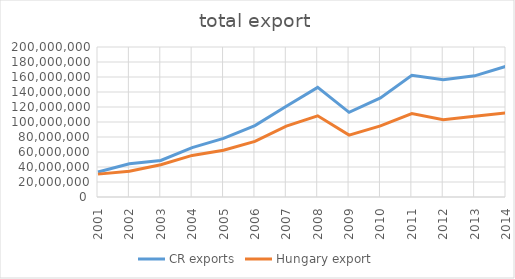
| Category | CR exports | Hungary export |
|---|---|---|
| 2001.0 | 33384210 | 30497719 |
| 2002.0 | 44263576 | 34336583 |
| 2003.0 | 48720350 | 43003656 |
| 2004.0 | 65771587 | 55468212 |
| 2005.0 | 78208548 | 62271839 |
| 2006.0 | 95140986 | 74055406 |
| 2007.0 | 120900492 | 94590870 |
| 2008.0 | 146087029 | 108211166 |
| 2009.0 | 112884321 | 82571847 |
| 2010.0 | 132140914 | 94748737 |
| 2011.0 | 162391721 | 111216834 |
| 2012.0 | 156422743 | 103006014 |
| 2013.0 | 161524152 | 107729976 |
| 2014.0 | 174279452 | 112196295 |